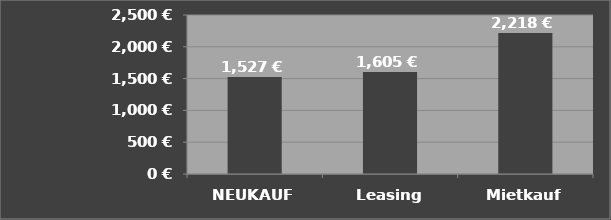
| Category | Monatsrate
(umgerechnet) |
|---|---|
| NEUKAUF | 1526.5 |
| Leasing | 1604.898 |
| Mietkauf | 2217.701 |